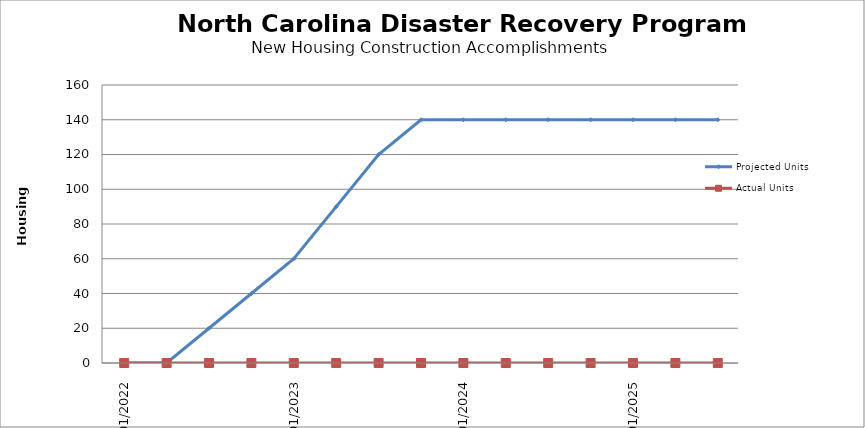
| Category | Projected Units | Actual Units |
|---|---|---|
| 01/2022 | 0 | 0 |
| 4/2022 | 0 | 0 |
| 07/2022 | 20 | 0 |
| 10/2022 | 40 | 0 |
| 01/2023 | 60 | 0 |
| 4/2023 | 90 | 0 |
| 07/2023 | 120 | 0 |
| 10/2023 | 140 | 0 |
| 01/2024 | 140 | 0 |
| 4/2024 | 140 | 0 |
| 07/2024 | 140 | 0 |
| 10/2024 | 140 | 0 |
| 01/2025 | 140 | 0 |
| 4/2025 | 140 | 0 |
| 07/2025 | 140 | 0 |